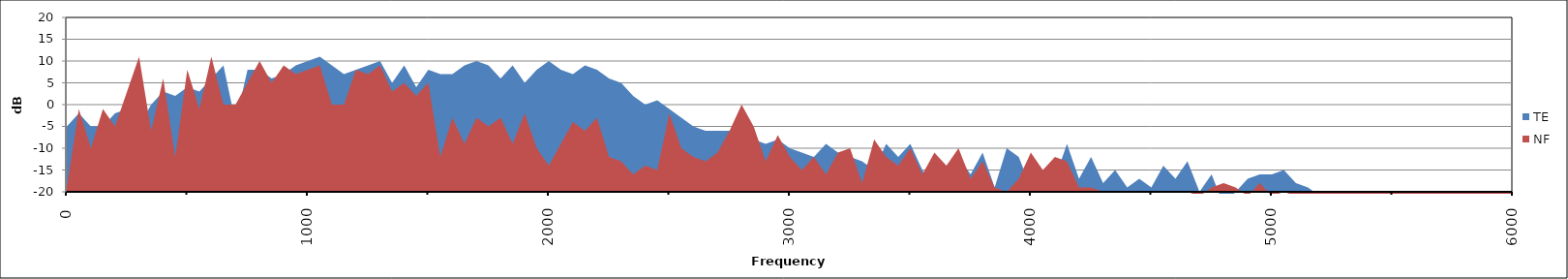
| Category | TE | NF |
|---|---|---|
| 0.0 | -5 | -19 |
| nan | -2 | -1 |
| nan | -5 | -10 |
| nan | -5 | -1 |
| nan | -2 | -5 |
| nan | -1 | 3 |
| nan | -5 | 11 |
| nan | 0 | -6 |
| nan | 3 | 6 |
| nan | 2 | -12 |
| nan | 4 | 8 |
| nan | 3 | -1 |
| nan | 6 | 11 |
| nan | 9 | 0 |
| nan | -4 | 0 |
| nan | 8 | 5 |
| nan | 8 | 10 |
| nan | 6 | 5 |
| nan | 7 | 9 |
| nan | 9 | 7 |
| 1000.0 | 10 | 8 |
| nan | 11 | 9 |
| nan | 9 | 0 |
| nan | 7 | 0 |
| nan | 8 | 8 |
| nan | 9 | 7 |
| nan | 10 | 9 |
| nan | 5 | 3 |
| nan | 9 | 5 |
| nan | 4 | 2 |
| nan | 8 | 5 |
| nan | 7 | -12 |
| nan | 7 | -3 |
| nan | 9 | -9 |
| nan | 10 | -3 |
| nan | 9 | -5 |
| nan | 6 | -3 |
| nan | 9 | -9 |
| nan | 5 | -2 |
| nan | 8 | -10 |
| 2000.0 | 10 | -14 |
| nan | 8 | -9 |
| nan | 7 | -4 |
| nan | 9 | -6 |
| nan | 8 | -3 |
| nan | 6 | -12 |
| nan | 5 | -13 |
| nan | 2 | -16 |
| nan | 0 | -14 |
| nan | 1 | -15 |
| nan | -1 | -2 |
| nan | -3 | -10 |
| nan | -5 | -12 |
| nan | -6 | -13 |
| nan | -6 | -11 |
| nan | -6 | -6 |
| nan | -5 | 0 |
| nan | -8 | -5 |
| nan | -9 | -13 |
| nan | -8 | -7 |
| 3000.0 | -10 | -12 |
| nan | -11 | -15 |
| nan | -12 | -12 |
| nan | -9 | -16 |
| nan | -11 | -11 |
| nan | -12 | -10 |
| nan | -13 | -18 |
| nan | -15 | -8 |
| nan | -9 | -12 |
| nan | -12 | -14 |
| nan | -9 | -10 |
| nan | -15 | -16 |
| nan | -19 | -11 |
| nan | -14 | -14 |
| nan | -12 | -10 |
| nan | -16 | -17 |
| nan | -11 | -13 |
| nan | -19 | -19 |
| nan | -10 | -20 |
| nan | -12 | -17 |
| 4000.0 | -19 | -11 |
| nan | -15 | -15 |
| nan | -17 | -12 |
| nan | -9 | -13 |
| nan | -17 | -19 |
| nan | -12 | -19 |
| nan | -18 | -20 |
| nan | -15 | -20 |
| nan | -19 | -20 |
| nan | -17 | -20 |
| nan | -19 | -20 |
| nan | -14 | -20 |
| nan | -17 | -20 |
| nan | -13 | -20 |
| nan | -20 | -21 |
| nan | -16 | -19 |
| nan | -23 | -18 |
| nan | -20 | -19 |
| nan | -17 | -21 |
| nan | -16 | -18 |
| 5000.0 | -16 | -21 |
| nan | -15 | -20 |
| nan | -18 | -21 |
| nan | -19 | -24 |
| nan | -21 | -25 |
| nan | -21 | -25 |
| nan | -21 | -25 |
| nan | -21 | -25 |
| nan | -21 | -25 |
| nan | -21 | -25 |
| nan | -21 | -25 |
| nan | -20 | -24 |
| nan | -21 | -25 |
| nan | -20 | -23 |
| nan | -21 | -25 |
| nan | -21 | -24 |
| nan | -21 | -25 |
| nan | -21 | -25 |
| nan | -21 | -25 |
| nan | -21 | -25 |
| 6000.0 | -21 | -25 |